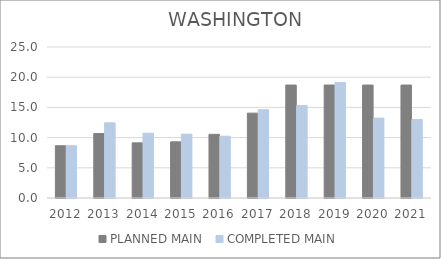
| Category | PLANNED MAIN  | COMPLETED MAIN |
|---|---|---|
| 2012.0 | 8.65 | 8.649 |
| 2013.0 | 10.67 | 12.445 |
| 2014.0 | 9.131 | 10.719 |
| 2015.0 | 9.3 | 10.57 |
| 2016.0 | 10.54 | 10.23 |
| 2017.0 | 14.05 | 14.62 |
| 2018.0 | 18.7 | 15.3 |
| 2019.0 | 18.7 | 19.1 |
| 2020.0 | 18.7 | 13.23 |
| 2021.0 | 18.7 | 12.98 |